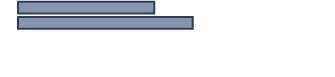
| Category | Series 0 |
|---|---|
| 0 | 43.815 |
| 1 | 56.185 |
| 2 | 0 |
| 3 | 0 |